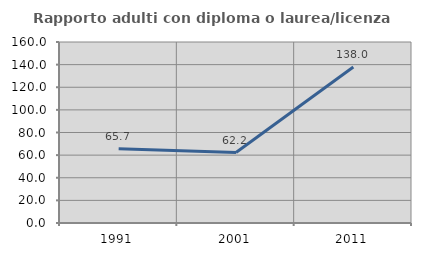
| Category | Rapporto adulti con diploma o laurea/licenza media  |
|---|---|
| 1991.0 | 65.714 |
| 2001.0 | 62.245 |
| 2011.0 | 137.975 |